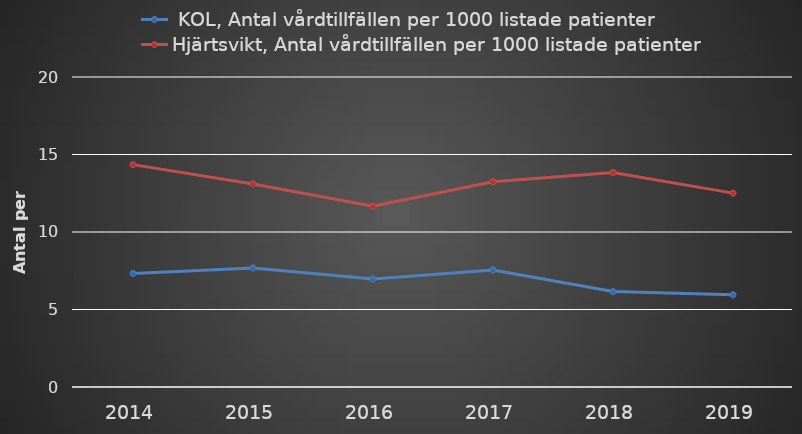
| Category |  KOL, Antal vårdtillfällen per 1000 listade patienter | Hjärtsvikt, Antal vårdtillfällen per 1000 listade patienter |
|---|---|---|
| 2014 | 7.324 | 14.348 |
| 2015 | 7.68 | 13.095 |
| 2016 | 6.964 | 11.655 |
| 2017 | 7.552 | 13.247 |
| 2018 | 6.155 | 13.841 |
| 2019 | 5.946 | 12.507 |